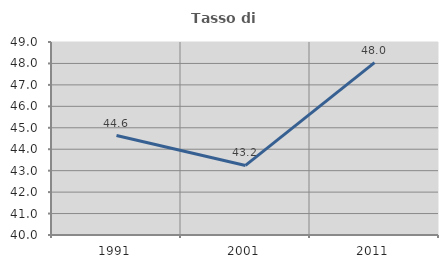
| Category | Tasso di occupazione   |
|---|---|
| 1991.0 | 44.639 |
| 2001.0 | 43.243 |
| 2011.0 | 48.039 |